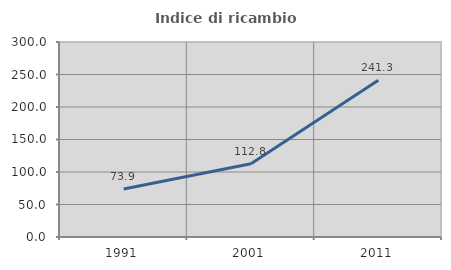
| Category | Indice di ricambio occupazionale  |
|---|---|
| 1991.0 | 73.938 |
| 2001.0 | 112.774 |
| 2011.0 | 241.27 |